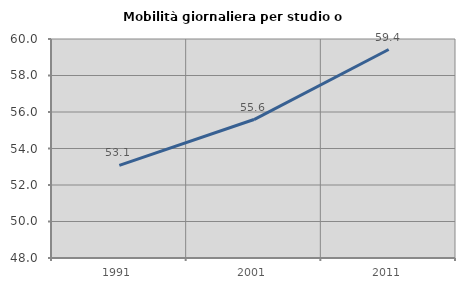
| Category | Mobilità giornaliera per studio o lavoro |
|---|---|
| 1991.0 | 53.079 |
| 2001.0 | 55.587 |
| 2011.0 | 59.424 |